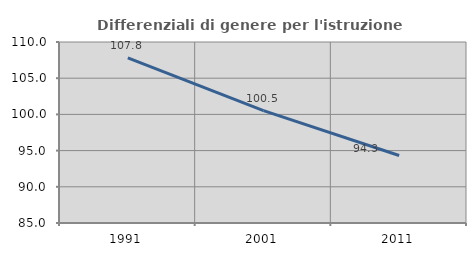
| Category | Differenziali di genere per l'istruzione superiore |
|---|---|
| 1991.0 | 107.803 |
| 2001.0 | 100.518 |
| 2011.0 | 94.327 |